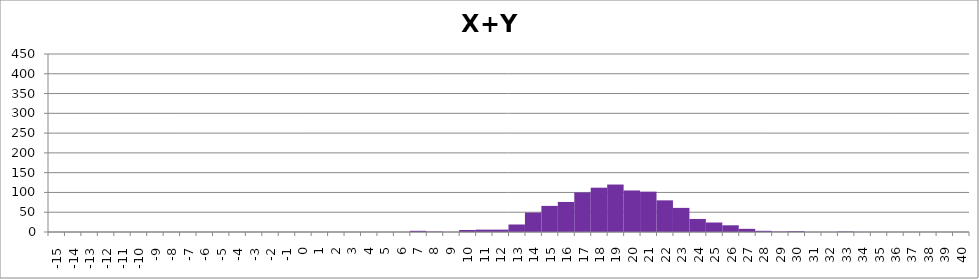
| Category | Freq v (x+y) |
|---|---|
| -15.0 | 0 |
| -14.0 | 0 |
| -13.0 | 0 |
| -12.0 | 0 |
| -11.0 | 0 |
| -10.0 | 0 |
| -9.0 | 0 |
| -8.0 | 0 |
| -7.0 | 0 |
| -6.0 | 0 |
| -5.0 | 0 |
| -4.0 | 0 |
| -3.0 | 0 |
| -2.0 | 0 |
| -1.0 | 0 |
| 0.0 | 0 |
| 1.0 | 0 |
| 2.0 | 0 |
| 3.0 | 0 |
| 4.0 | 0 |
| 5.0 | 0 |
| 6.0 | 0 |
| 7.0 | 3 |
| 8.0 | 1 |
| 9.0 | 0 |
| 10.0 | 5 |
| 11.0 | 6 |
| 12.0 | 6 |
| 13.0 | 19 |
| 14.0 | 49 |
| 15.0 | 66 |
| 16.0 | 76 |
| 17.0 | 100 |
| 18.0 | 112 |
| 19.0 | 120 |
| 20.0 | 105 |
| 21.0 | 102 |
| 22.0 | 80 |
| 23.0 | 61 |
| 24.0 | 33 |
| 25.0 | 24 |
| 26.0 | 17 |
| 27.0 | 8 |
| 28.0 | 3 |
| 29.0 | 1 |
| 30.0 | 2 |
| 31.0 | 0 |
| 32.0 | 0 |
| 33.0 | 1 |
| 34.0 | 0 |
| 35.0 | 0 |
| 36.0 | 0 |
| 37.0 | 0 |
| 38.0 | 0 |
| 39.0 | 0 |
| 40.0 | 0 |